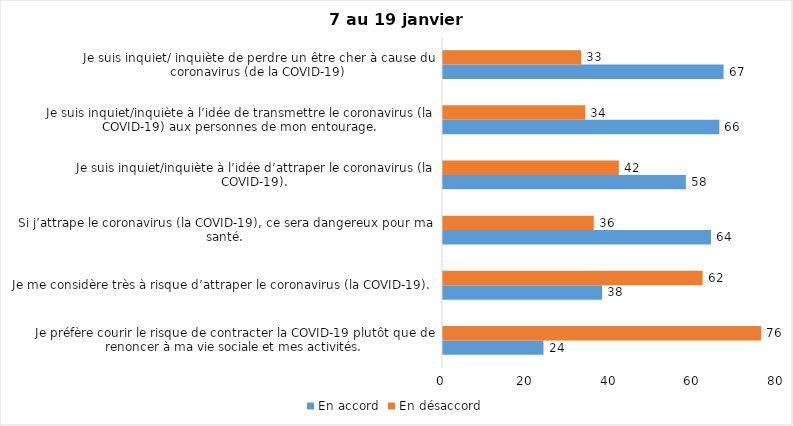
| Category | En accord | En désaccord |
|---|---|---|
| Je préfère courir le risque de contracter la COVID-19 plutôt que de renoncer à ma vie sociale et mes activités. | 24 | 76 |
| Je me considère très à risque d’attraper le coronavirus (la COVID-19). | 38 | 62 |
| Si j’attrape le coronavirus (la COVID-19), ce sera dangereux pour ma santé. | 64 | 36 |
| Je suis inquiet/inquiète à l’idée d’attraper le coronavirus (la COVID-19). | 58 | 42 |
| Je suis inquiet/inquiète à l’idée de transmettre le coronavirus (la COVID-19) aux personnes de mon entourage. | 66 | 34 |
| Je suis inquiet/ inquiète de perdre un être cher à cause du coronavirus (de la COVID-19) | 67 | 33 |